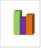
| Category | област Търговище |
|---|---|
| летен сезон 2019  | 16635 |
| летен сезон 2021  | 11966 |
| летен сезон 2022 г.  | 14110 |